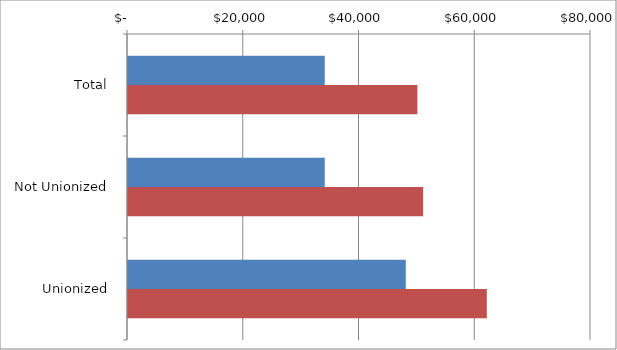
| Category | Series 0 | Series 1 |
|---|---|---|
| Total | 34000 | 50000 |
|  Not Unionized  | 34000 | 51000 |
|  Unionized  | 48000 | 62000 |